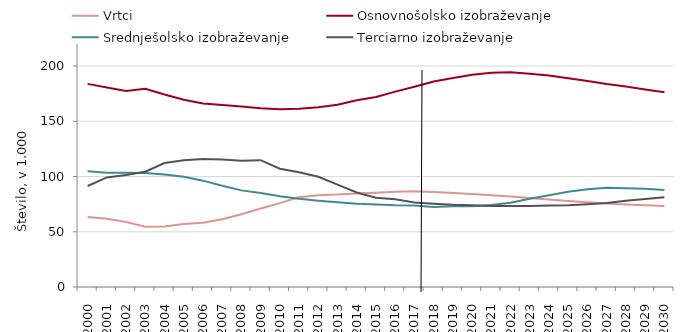
| Category | Vrtci | Osnovnošolsko izobraževanje | Srednješolsko izobraževanje | Terciarno izobraževanje |
|---|---|---|---|---|
| 2000 | 63328 | 183897 | 104840 | 91494 |
| 2001 | 61803 | 180692 | 103528 | 99214 |
| 2002 | 58968 | 177484 | 103538 | 101458 |
| 2003 | 54515 | 179532 | 103203 | 104396 |
| 2004 | 54815 | 174315 | 101878 | 112228 |
| 2005 | 57134 | 169599 | 99860 | 114794 |
| 2006 | 58127 | 166101 | 96310 | 115944 |
| 2007 | 61359 | 164768 | 91623 | 115445 |
| 2008 | 65966 | 163458 | 87501 | 114391 |
| 2009 | 71124 | 161805 | 85030 | 114873 |
| 2010 | 75975 | 161046 | 82267 | 107134 |
| 2011 | 81221 | 161357 | 79901 | 104003 |
| 2012 | 83090 | 162775 | 78208 | 99877 |
| 2013 | 83700 | 165036 | 76714 | 92769 |
| 2014 | 84750 | 169101 | 75325 | 85616 |
| 2015 | 85407 | 172013 | 74759 | 80798 |
| 2016 | 86284 | 176898 | 74021 | 79547 |
| 2017 | 86703 | 181301 | 73776 | 76534 |
| 2018 | 86047.27 | 186038.928 | 72557.014 | 75493.629 |
| 2019 | 85234.757 | 189198.873 | 73067.599 | 74440.753 |
| 2020 | 84151.417 | 192224.543 | 73060.02 | 73966.442 |
| 2021 | 83094.072 | 193942.789 | 74308.5 | 73392.635 |
| 2022 | 82018.479 | 194399.02 | 76309.776 | 73263.049 |
| 2023 | 80649.409 | 193099.042 | 80012.855 | 73299.389 |
| 2024 | 79284.105 | 191468.35 | 83035.431 | 73751.187 |
| 2025 | 77977.638 | 188988.144 | 86328.685 | 74059.009 |
| 2026 | 76775.096 | 186539.827 | 88532.804 | 74896.343 |
| 2027 | 75696.977 | 183779.693 | 89989.083 | 76112.957 |
| 2028 | 74777.809 | 181478.069 | 89386.159 | 78025.748 |
| 2029 | 74030.806 | 178878.898 | 88954.437 | 79686.465 |
| 2030 | 73477.506 | 176403.028 | 87780.615 | 81375.28 |